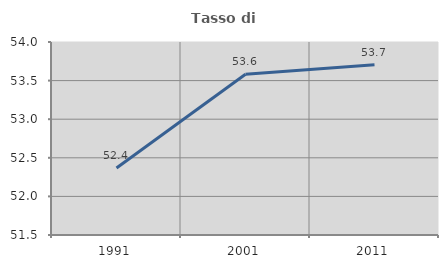
| Category | Tasso di occupazione   |
|---|---|
| 1991.0 | 52.368 |
| 2001.0 | 53.582 |
| 2011.0 | 53.705 |